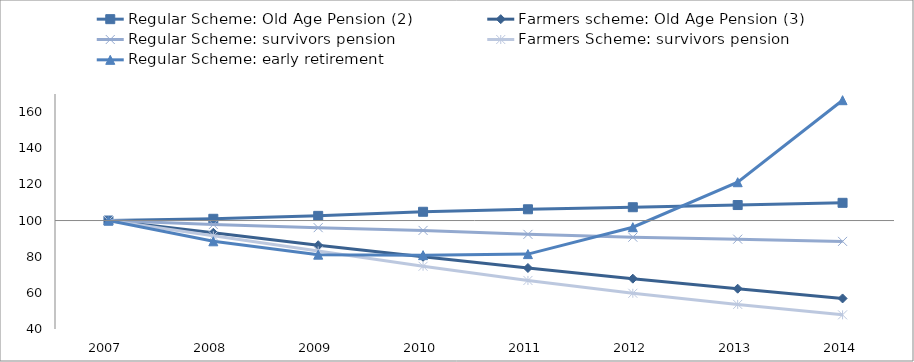
| Category | Regular Scheme: Old Age Pension (2) | Farmers scheme: Old Age Pension (3) | Regular Scheme: survivors pension | Farmers Scheme: survivors pension | Regular Scheme: early retirement |
|---|---|---|---|---|---|
| 2007.0 | 100 | 100 | 100 | 100 | 100 |
| 2008.0 | 100.97 | 93.243 | 97.781 | 91.56 | 88.517 |
| 2009.0 | 102.586 | 86.353 | 96.054 | 83.189 | 81.123 |
| 2010.0 | 104.846 | 79.916 | 94.536 | 74.698 | 80.854 |
| 2011.0 | 106.23 | 73.745 | 92.356 | 66.855 | 81.437 |
| 2012.0 | 107.36 | 67.838 | 90.787 | 59.762 | 96.311 |
| 2013.0 | 108.574 | 62.293 | 89.685 | 53.607 | 121.199 |
| 2014.0 | 109.798 | 56.899 | 88.465 | 47.839 | 166.573 |